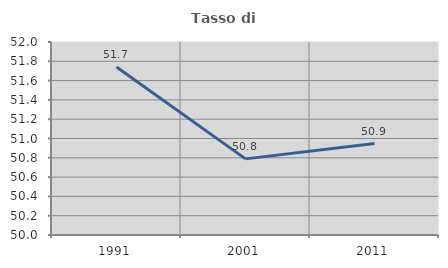
| Category | Tasso di occupazione   |
|---|---|
| 1991.0 | 51.74 |
| 2001.0 | 50.789 |
| 2011.0 | 50.947 |